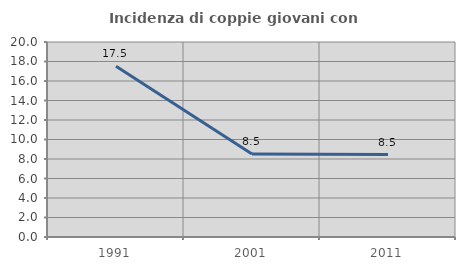
| Category | Incidenza di coppie giovani con figli |
|---|---|
| 1991.0 | 17.521 |
| 2001.0 | 8.507 |
| 2011.0 | 8.455 |